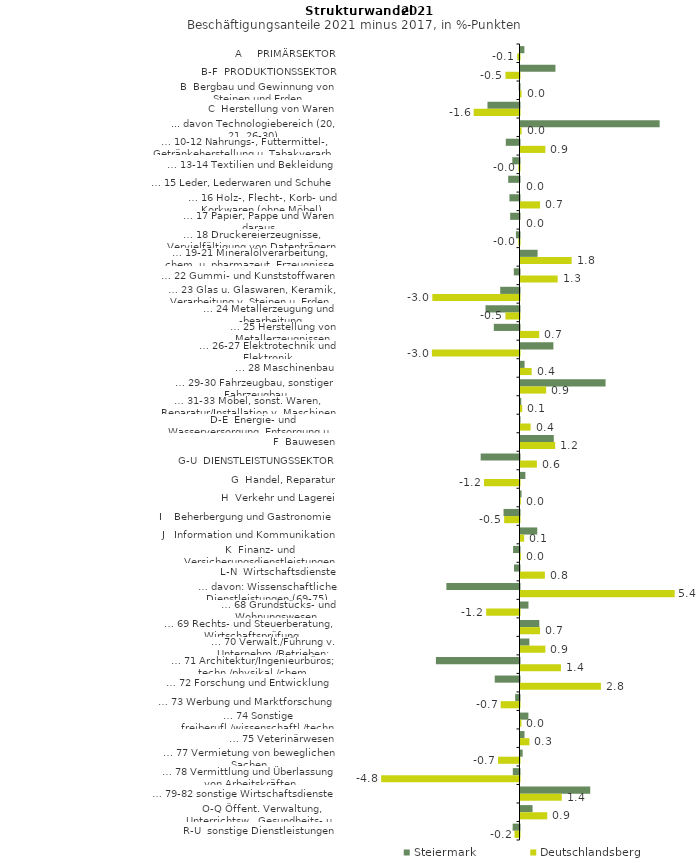
| Category | Steiermark | Deutschlandsberg |
|---|---|---|
| A     PRIMÄRSEKTOR | 0.135 | -0.077 |
| B-F  PRODUKTIONSSEKTOR | 1.215 | -0.488 |
| B  Bergbau und Gewinnung von Steinen und Erden | -0.029 | 0.035 |
| C  Herstellung von Waren | -1.114 | -1.593 |
| ... davon Technologiebereich (20, 21, 26-30) | 4.84 | 0.039 |
| … 10-12 Nahrungs-, Futtermittel-, Getränkeherstellung u. Tabakverarb. | -0.477 | 0.865 |
| … 13-14 Textilien und Bekleidung | -0.249 | -0.039 |
| … 15 Leder, Lederwaren und Schuhe | -0.393 | 0 |
| … 16 Holz-, Flecht-, Korb- und Korkwaren (ohne Möbel)  | -0.35 | 0.68 |
| … 17 Papier, Pappe und Waren daraus  | -0.325 | 0 |
| … 18 Druckereierzeugnisse, Vervielfältigung von Datenträgern | -0.124 | -0.041 |
| … 19-21 Mineralölverarbeitung, chem. u. pharmazeut. Erzeugnisse | 0.594 | 1.778 |
| … 22 Gummi- und Kunststoffwaren | -0.198 | 1.293 |
| … 23 Glas u. Glaswaren, Keramik, Verarbeitung v. Steinen u. Erden  | -0.671 | -3.032 |
| … 24 Metallerzeugung und -bearbeitung | -1.183 | -0.488 |
| … 25 Herstellung von Metallerzeugnissen  | -0.894 | 0.651 |
| … 26-27 Elektrotechnik und Elektronik | 1.144 | -3.046 |
| … 28 Maschinenbau | 0.141 | 0.387 |
| … 29-30 Fahrzeugbau, sonstiger Fahrzeugbau | 2.959 | 0.893 |
| … 31-33 Möbel, sonst. Waren, Reparatur/Installation v. Maschinen | 0.026 | 0.06 |
| D-E  Energie- und Wasserversorgung, Entsorgung u. Rückgewinnung | -0.016 | 0.351 |
| F  Bauwesen | 1.158 | 1.206 |
| G-U  DIENSTLEISTUNGSSEKTOR | -1.351 | 0.57 |
| G  Handel, Reparatur | 0.17 | -1.234 |
| H  Verkehr und Lagerei | 0.036 | 0.011 |
| I    Beherbergung und Gastronomie | -0.556 | -0.533 |
| J   Information und Kommunikation | 0.584 | 0.129 |
| K  Finanz- und Versicherungsdienstleistungen | -0.224 | 0.014 |
| L-N  Wirtschaftsdienste | -0.191 | 0.847 |
| … davon: Wissenschaftliche Dienstleistungen (69-75) | -2.544 | 5.363 |
| … 68 Grundstücks- und Wohnungswesen  | 0.278 | -1.16 |
| … 69 Rechts- und Steuerberatung, Wirtschaftsprüfung | 0.654 | 0.681 |
| … 70 Verwalt./Führung v. Unternehm./Betrieben; Unternehmensberat. | 0.309 | 0.866 |
| … 71 Architektur/Ingenieurbüros; techn./physikal./chem. Untersuchung | -2.908 | 1.407 |
| … 72 Forschung und Entwicklung  | -0.862 | 2.796 |
| … 73 Werbung und Marktforschung | -0.151 | -0.654 |
| … 74 Sonstige freiberufl./wissenschaftl./techn. Tätigkeiten | 0.275 | 0.03 |
| … 75 Veterinärwesen | 0.139 | 0.311 |
| … 77 Vermietung von beweglichen Sachen  | 0.075 | -0.745 |
| … 78 Vermittlung und Überlassung von Arbeitskräften | -0.233 | -4.811 |
| … 79-82 sonstige Wirtschaftsdienste | 2.426 | 1.436 |
| O-Q Öffent. Verwaltung, Unterrichtsw., Gesundheits- u. Sozialwesen | 0.419 | 0.93 |
| R-U  sonstige Dienstleistungen | -0.238 | -0.173 |